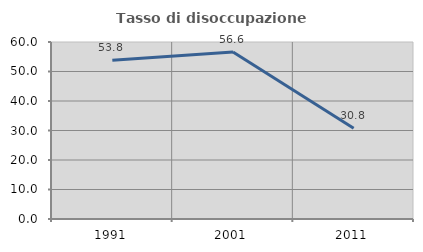
| Category | Tasso di disoccupazione giovanile  |
|---|---|
| 1991.0 | 53.846 |
| 2001.0 | 56.604 |
| 2011.0 | 30.769 |